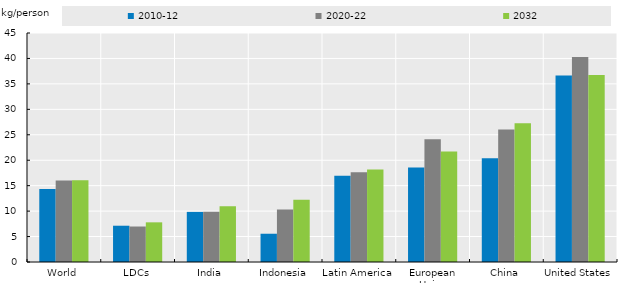
| Category | 2010-12 | 2020-22 | 2032 |
|---|---|---|---|
| World | 14.356 | 15.998 | 16.064 |
| LDCs | 7.13 | 6.973 | 7.794 |
| India | 9.847 | 9.873 | 10.952 |
| Indonesia | 5.554 | 10.315 | 12.238 |
| Latin America | 16.946 | 17.614 | 18.176 |
| European Union | 18.549 | 24.1 | 21.728 |
| China | 20.375 | 26.02 | 27.241 |
| United States | 36.628 | 40.263 | 36.756 |